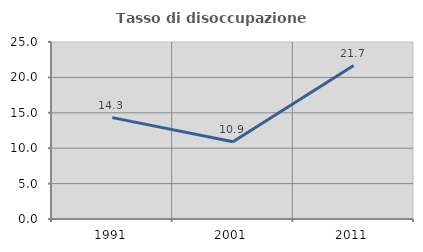
| Category | Tasso di disoccupazione giovanile  |
|---|---|
| 1991.0 | 14.318 |
| 2001.0 | 10.924 |
| 2011.0 | 21.678 |